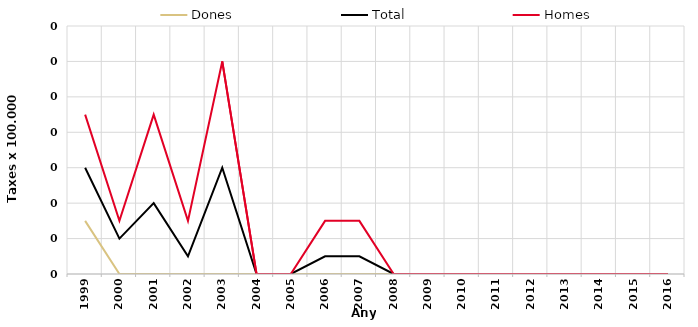
| Category | Dones | Total | Homes |
|---|---|---|---|
| 1999.0 | 0.03 | 0.06 | 0.09 |
| 2000.0 | 0 | 0.02 | 0.03 |
| 2001.0 | 0 | 0.04 | 0.09 |
| 2002.0 | 0 | 0.01 | 0.03 |
| 2003.0 | 0 | 0.06 | 0.12 |
| 2004.0 | 0 | 0 | 0 |
| 2005.0 | 0 | 0 | 0 |
| 2006.0 | 0 | 0.01 | 0.03 |
| 2007.0 | 0 | 0.01 | 0.03 |
| 2008.0 | 0 | 0 | 0 |
| 2009.0 | 0 | 0 | 0 |
| 2010.0 | 0 | 0 | 0 |
| 2011.0 | 0 | 0 | 0 |
| 2012.0 | 0 | 0 | 0 |
| 2013.0 | 0 | 0 | 0 |
| 2014.0 | 0 | 0 | 0 |
| 2015.0 | 0 | 0 | 0 |
| 2016.0 | 0 | 0 | 0 |